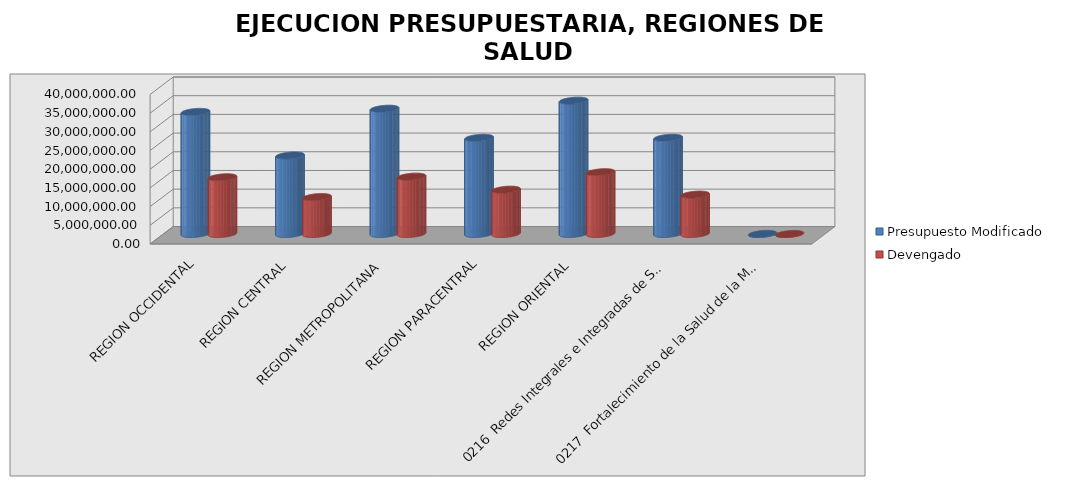
| Category | Presupuesto Modificado | Devengado |
|---|---|---|
| REGION OCCIDENTAL | 32670202 | 15179421.57 |
| REGION CENTRAL | 21002930 | 9887928.95 |
| REGION METROPOLITANA | 33520596 | 15347874.09 |
| REGION PARACENTRAL | 25731198 | 11861977.1 |
| REGION ORIENTAL | 35680807 | 16536179.43 |
| 0216  Redes Integrales e Integradas de Servicios de Salud 2017 | 25742461 | 10540411.84 |
| 0217  Fortalecimiento de la Salud de la Mujer - Primer Nivel de Atención 2017 | 33414 | 14528.89 |